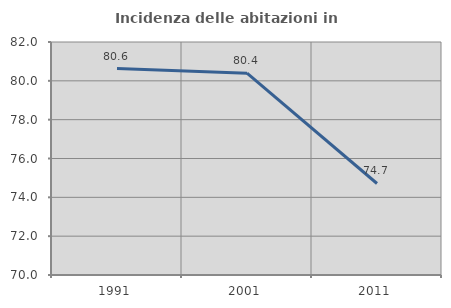
| Category | Incidenza delle abitazioni in proprietà  |
|---|---|
| 1991.0 | 80.632 |
| 2001.0 | 80.392 |
| 2011.0 | 74.713 |